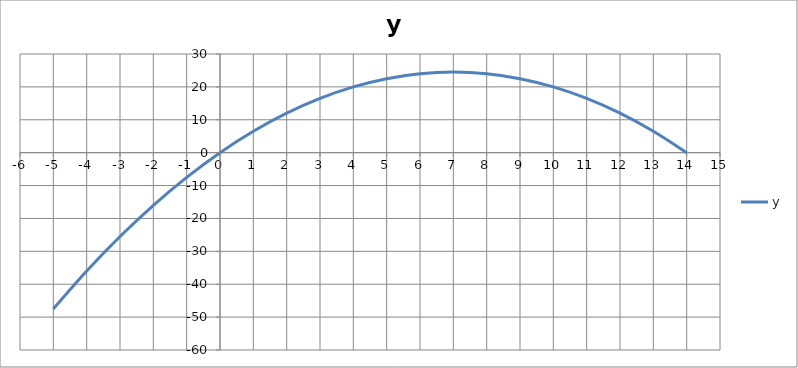
| Category | y |
|---|---|
| -5.0 | -47.5 |
| -4.0 | -36 |
| -3.0 | -25.5 |
| -2.0 | -16 |
| -1.0 | -7.5 |
| 0.0 | 0 |
| 1.0 | 6.5 |
| 2.0 | 12 |
| 3.0 | 16.5 |
| 4.0 | 20 |
| 5.0 | 22.5 |
| 6.0 | 24 |
| 7.0 | 24.5 |
| 8.0 | 24 |
| 9.0 | 22.5 |
| 10.0 | 20 |
| 11.0 | 16.5 |
| 12.0 | 12 |
| 13.0 | 6.5 |
| 14.0 | 0 |